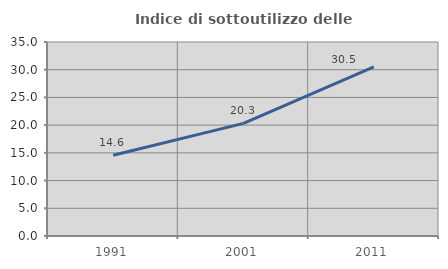
| Category | Indice di sottoutilizzo delle abitazioni  |
|---|---|
| 1991.0 | 14.563 |
| 2001.0 | 20.311 |
| 2011.0 | 30.524 |